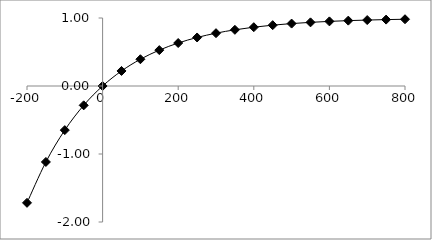
| Category | Series 0 |
|---|---|
| -200.0 | -1.718 |
| -150.0 | -1.117 |
| -100.0 | -0.649 |
| -50.0 | -0.284 |
| 0.0 | 0 |
| 50.0 | 0.221 |
| 100.0 | 0.393 |
| 150.0 | 0.528 |
| 200.0 | 0.632 |
| 250.0 | 0.713 |
| 300.0 | 0.777 |
| 350.0 | 0.826 |
| 400.0 | 0.865 |
| 450.0 | 0.895 |
| 500.0 | 0.918 |
| 550.0 | 0.936 |
| 600.0 | 0.95 |
| 650.0 | 0.961 |
| 700.0 | 0.97 |
| 750.0 | 0.976 |
| 800.0 | 0.982 |
| 850.0 | 0.986 |